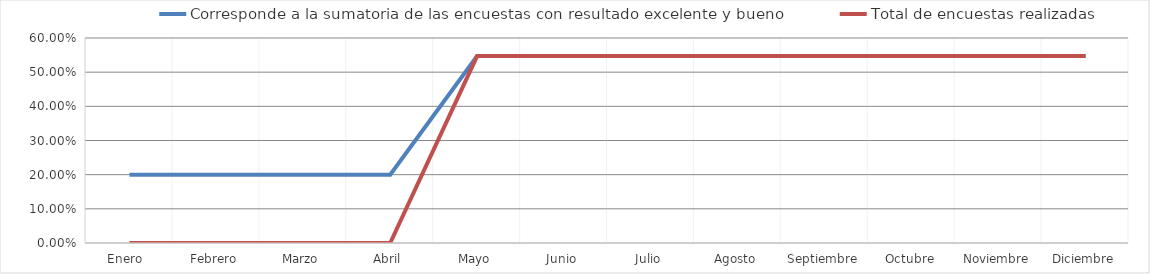
| Category | Corresponde a la sumatoria de las encuestas con resultado excelente y bueno | Total de encuestas realizadas |
|---|---|---|
| Enero  | 0.2 | 0 |
| Febrero | 0.2 | 0 |
| Marzo | 0.2 | 0 |
| Abril | 0.2 | 0 |
| Mayo | 0.547 | 0.547 |
| Junio | 0.547 | 0.547 |
| Julio | 0.547 | 0.547 |
| Agosto | 0.547 | 0.547 |
| Septiembre | 0.547 | 0.547 |
| Octubre | 0.547 | 0.547 |
| Noviembre | 0.547 | 0.547 |
| Diciembre | 0.547 | 0.547 |